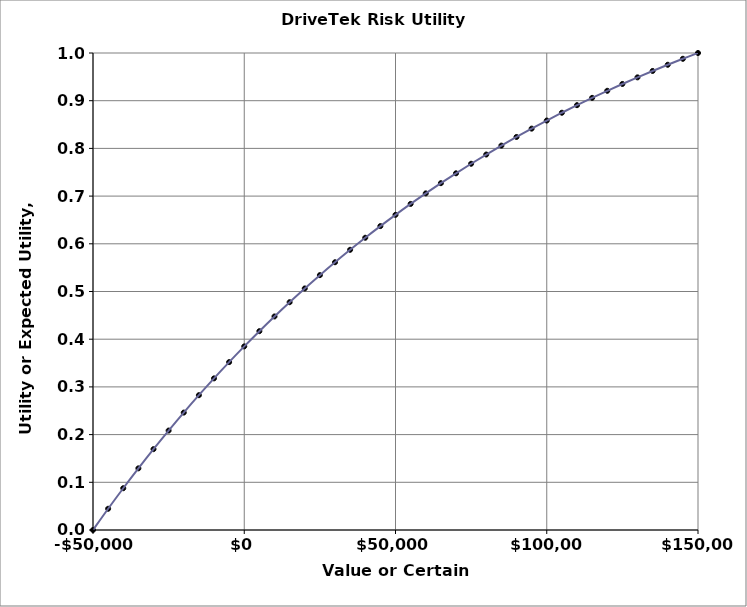
| Category | Series 0 |
|---|---|
| -50000.0 | 0 |
| -45000.0 | 0.045 |
| -40000.0 | 0.088 |
| -35000.0 | 0.129 |
| -30000.0 | 0.17 |
| -25000.0 | 0.208 |
| -20000.0 | 0.246 |
| -15000.0 | 0.283 |
| -10000.0 | 0.318 |
| -5000.0 | 0.352 |
| 0.0 | 0.385 |
| 5000.0 | 0.417 |
| 10000.0 | 0.448 |
| 15000.0 | 0.478 |
| 20000.0 | 0.506 |
| 25000.0 | 0.534 |
| 30000.0 | 0.561 |
| 35000.0 | 0.587 |
| 40000.0 | 0.613 |
| 45000.0 | 0.637 |
| 50000.0 | 0.661 |
| 55000.0 | 0.684 |
| 60000.0 | 0.706 |
| 65000.0 | 0.727 |
| 70000.0 | 0.748 |
| 75000.0 | 0.768 |
| 80000.0 | 0.787 |
| 85000.0 | 0.806 |
| 90000.0 | 0.824 |
| 95000.0 | 0.841 |
| 100000.0 | 0.858 |
| 105000.0 | 0.875 |
| 110000.0 | 0.891 |
| 115000.0 | 0.906 |
| 120000.0 | 0.921 |
| 125000.0 | 0.935 |
| 130000.0 | 0.949 |
| 135000.0 | 0.962 |
| 140000.0 | 0.975 |
| 145000.0 | 0.988 |
| 150000.0 | 1 |